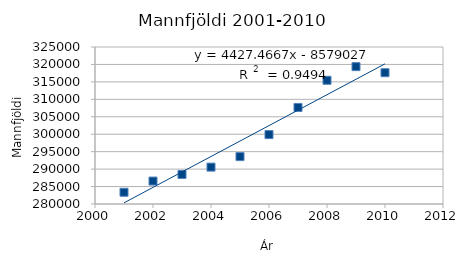
| Category | Mannfjöldi 1. janúar |
|---|---|
| 2001.0 | 283361 |
| 2002.0 | 286575 |
| 2003.0 | 288471 |
| 2004.0 | 290570 |
| 2005.0 | 293577 |
| 2006.0 | 299891 |
| 2007.0 | 307672 |
| 2008.0 | 315459 |
| 2009.0 | 319368 |
| 2010.0 | 317630 |